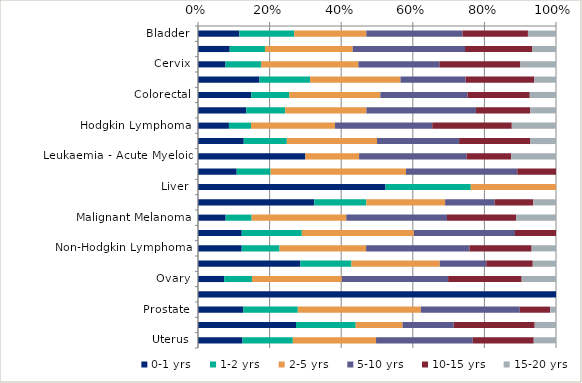
| Category | 0-1 yrs | 1-2 yrs | 2-5 yrs | 5-10 yrs | 10-15 yrs | 15-20 yrs |
|---|---|---|---|---|---|---|
| Bladder | 0.116 | 0.153 | 0.201 | 0.269 | 0.183 | 0.078 |
| Breast | 0.089 | 0.098 | 0.245 | 0.314 | 0.188 | 0.066 |
| Cervix | 0.077 | 0.1 | 0.271 | 0.226 | 0.226 | 0.1 |
| Central Nervous System (including Brain) | 0.172 | 0.141 | 0.253 | 0.182 | 0.192 | 0.061 |
| Colorectal | 0.149 | 0.106 | 0.254 | 0.244 | 0.174 | 0.073 |
| Head and Neck | 0.135 | 0.109 | 0.227 | 0.306 | 0.151 | 0.072 |
| Hodgkin Lymphoma | 0.086 | 0.062 | 0.235 | 0.272 | 0.222 | 0.123 |
| Kidney and unspecified urinary organs | 0.128 | 0.12 | 0.252 | 0.229 | 0.199 | 0.071 |
| Leukaemia - Acute Myeloid | 0.3 | 0 | 0.15 | 0.3 | 0.125 | 0.125 |
| Leukaemia - Chronic Lymphocytic | 0.108 | 0.095 | 0.378 | 0.311 | 0.108 | 0 |
| Liver | 0.524 | 0.238 | 0.238 | 0 | 0 | 0 |
| Lung | 0.325 | 0.146 | 0.22 | 0.138 | 0.108 | 0.063 |
| Malignant Melanoma | 0.077 | 0.073 | 0.264 | 0.281 | 0.193 | 0.111 |
| Multiple Myeloma | 0.122 | 0.168 | 0.313 | 0.282 | 0.115 | 0 |
| Non-Hodgkin Lymphoma | 0.122 | 0.106 | 0.242 | 0.289 | 0.174 | 0.068 |
| Oesophagus | 0.286 | 0.143 | 0.247 | 0.13 | 0.13 | 0.065 |
| Ovary | 0.073 | 0.078 | 0.251 | 0.297 | 0.205 | 0.096 |
| Pancreas | 1 | 0 | 0 | 0 | 0 | 0 |
| Prostate | 0.127 | 0.152 | 0.344 | 0.276 | 0.085 | 0.016 |
| Stomach | 0.274 | 0.167 | 0.131 | 0.143 | 0.226 | 0.06 |
| Uterus | 0.124 | 0.141 | 0.232 | 0.27 | 0.17 | 0.062 |